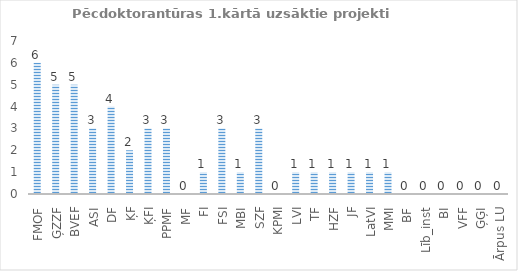
| Category | Series 0 |
|---|---|
| FMOF | 6 |
| ĢZZF | 5 |
| BVEF | 5 |
| ASI | 3 |
| DF | 4 |
| ĶF | 2 |
| ĶFI | 3 |
| PPMF | 3 |
| MF | 0 |
| FI | 1 |
| FSI | 3 |
| MBI | 1 |
| SZF | 3 |
| KPMI | 0 |
| LVI | 1 |
| TF | 1 |
| HZF | 1 |
| JF | 1 |
| LatVI | 1 |
| MMI | 1 |
| BF | 0 |
| Līb_inst | 0 |
| BI | 0 |
| VFF | 0 |
| ĢĢI | 0 |
| Ārpus LU | 0 |